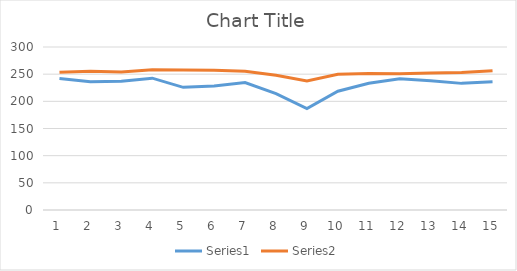
| Category | Series 0 | Series 1 |
|---|---|---|
| 0 | 241.912 | 253.38 |
| 1 | 235.86 | 255.25 |
| 2 | 236.778 | 253.815 |
| 3 | 242.671 | 258.144 |
| 4 | 225.741 | 257.823 |
| 5 | 228.151 | 257.104 |
| 6 | 234.643 | 255.538 |
| 7 | 214.257 | 247.867 |
| 8 | 186.8 | 237.469 |
| 9 | 218.612 | 249.693 |
| 10 | 233.287 | 251.025 |
| 11 | 241.659 | 250.565 |
| 12 | 237.956 | 252.189 |
| 13 | 233.061 | 252.977 |
| 14 | 235.891 | 256.219 |